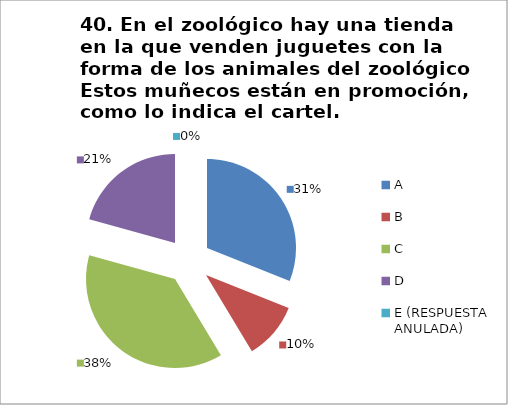
| Category | CANTIDAD DE RESPUESTAS PREGUNTA (40) | PORCENTAJE |
|---|---|---|
| A | 9 | 0.31 |
| B | 3 | 0.103 |
| C | 11 | 0.379 |
| D | 6 | 0.207 |
| E (RESPUESTA ANULADA) | 0 | 0 |